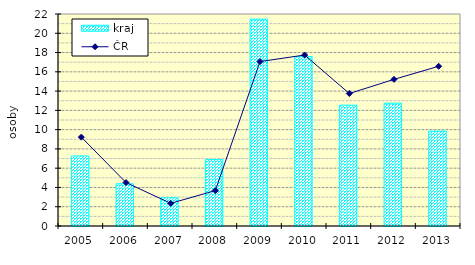
| Category | kraj |
|---|---|
| 2005.0 | 7.272 |
| 2006.0 | 4.383 |
| 2007.0 | 2.932 |
| 2008.0 | 6.893 |
| 2009.0 | 21.471 |
| 2010.0 | 17.582 |
| 2011.0 | 12.541 |
| 2012.0 | 12.742 |
| 2013.0 | 9.846 |